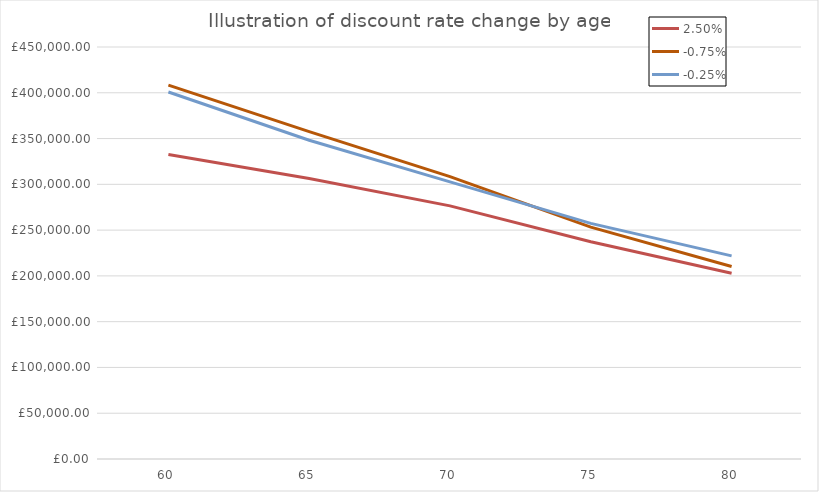
| Category | 2.50% | -0.75% | -0.25% |
|---|---|---|---|
| 60.0 | 332695.65 | 408297.45 | 400823.6 |
| 65.0 | 306297.2 | 357503.6 | 348196.4 |
| 70.0 | 276478.85 | 308415.05 | 302746.7 |
| 75.0 | 237288 | 253308.4 | 257321.2 |
| 80.0 | 202831 | 210301 | 221895.7 |